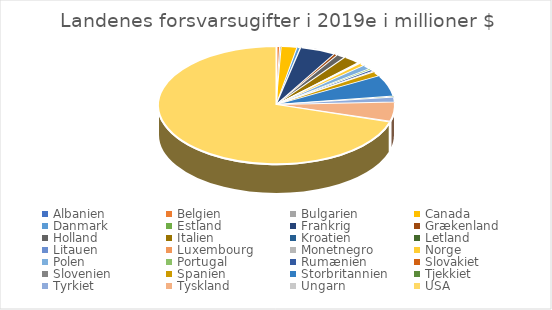
| Category | Landenes forsvarsugifter i 2019e i millioner $ |
|---|---|
| Albanien | 198 |
| Belgien | 4921 |
| Bulgarien | 2179 |
| Canada | 22485 |
| Danmark | 4651 |
| Estland | 670 |
| Frankrig | 50729 |
| Grækenland | 4940 |
| Holland | 12478 |
| Italien | 24482 |
| Kroatien | 1032 |
| Letland | 724 |
| Litauen  | 1107 |
| Luxembourg  | 395 |
| Monetnegro | 92 |
| Norge | 7708 |
| Polen  | 11902 |
| Portugal | 3613 |
| Rumænien  | 5050 |
| Slovakiet | 1905 |
| Slovenien  | 581 |
| Spanien  | 13156 |
| Storbritannien | 60761 |
| Tjekkiet | 2967 |
| Tyrkiet | 13919 |
| Tyskland | 54751 |
| Ungarn | 2080 |
| USA | 730149 |